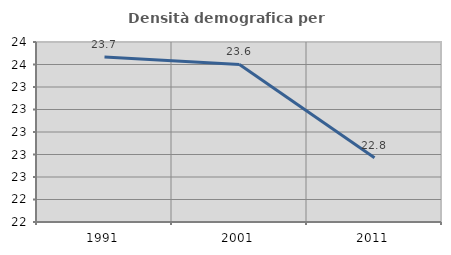
| Category | Densità demografica |
|---|---|
| 1991.0 | 23.667 |
| 2001.0 | 23.601 |
| 2011.0 | 22.771 |